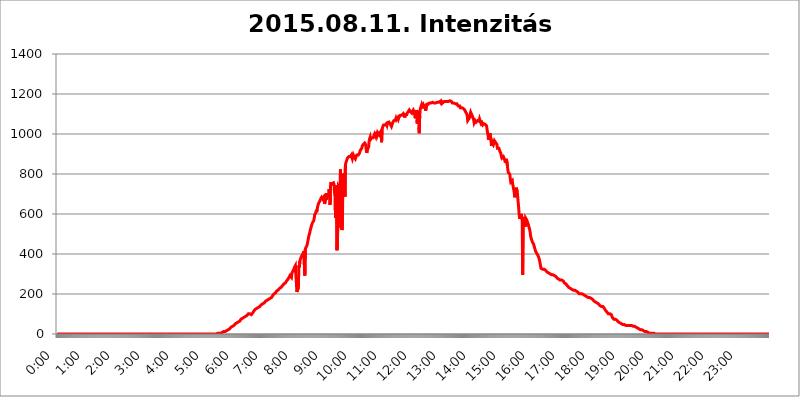
| Category | 2015.08.11. Intenzitás [W/m^2] |
|---|---|
| 0.0 | 0 |
| 0.0006944444444444445 | 0 |
| 0.001388888888888889 | 0 |
| 0.0020833333333333333 | 0 |
| 0.002777777777777778 | 0 |
| 0.003472222222222222 | 0 |
| 0.004166666666666667 | 0 |
| 0.004861111111111111 | 0 |
| 0.005555555555555556 | 0 |
| 0.0062499999999999995 | 0 |
| 0.006944444444444444 | 0 |
| 0.007638888888888889 | 0 |
| 0.008333333333333333 | 0 |
| 0.009027777777777779 | 0 |
| 0.009722222222222222 | 0 |
| 0.010416666666666666 | 0 |
| 0.011111111111111112 | 0 |
| 0.011805555555555555 | 0 |
| 0.012499999999999999 | 0 |
| 0.013194444444444444 | 0 |
| 0.013888888888888888 | 0 |
| 0.014583333333333332 | 0 |
| 0.015277777777777777 | 0 |
| 0.015972222222222224 | 0 |
| 0.016666666666666666 | 0 |
| 0.017361111111111112 | 0 |
| 0.018055555555555557 | 0 |
| 0.01875 | 0 |
| 0.019444444444444445 | 0 |
| 0.02013888888888889 | 0 |
| 0.020833333333333332 | 0 |
| 0.02152777777777778 | 0 |
| 0.022222222222222223 | 0 |
| 0.02291666666666667 | 0 |
| 0.02361111111111111 | 0 |
| 0.024305555555555556 | 0 |
| 0.024999999999999998 | 0 |
| 0.025694444444444447 | 0 |
| 0.02638888888888889 | 0 |
| 0.027083333333333334 | 0 |
| 0.027777777777777776 | 0 |
| 0.02847222222222222 | 0 |
| 0.029166666666666664 | 0 |
| 0.029861111111111113 | 0 |
| 0.030555555555555555 | 0 |
| 0.03125 | 0 |
| 0.03194444444444445 | 0 |
| 0.03263888888888889 | 0 |
| 0.03333333333333333 | 0 |
| 0.034027777777777775 | 0 |
| 0.034722222222222224 | 0 |
| 0.035416666666666666 | 0 |
| 0.036111111111111115 | 0 |
| 0.03680555555555556 | 0 |
| 0.0375 | 0 |
| 0.03819444444444444 | 0 |
| 0.03888888888888889 | 0 |
| 0.03958333333333333 | 0 |
| 0.04027777777777778 | 0 |
| 0.04097222222222222 | 0 |
| 0.041666666666666664 | 0 |
| 0.042361111111111106 | 0 |
| 0.04305555555555556 | 0 |
| 0.043750000000000004 | 0 |
| 0.044444444444444446 | 0 |
| 0.04513888888888889 | 0 |
| 0.04583333333333334 | 0 |
| 0.04652777777777778 | 0 |
| 0.04722222222222222 | 0 |
| 0.04791666666666666 | 0 |
| 0.04861111111111111 | 0 |
| 0.049305555555555554 | 0 |
| 0.049999999999999996 | 0 |
| 0.05069444444444445 | 0 |
| 0.051388888888888894 | 0 |
| 0.052083333333333336 | 0 |
| 0.05277777777777778 | 0 |
| 0.05347222222222222 | 0 |
| 0.05416666666666667 | 0 |
| 0.05486111111111111 | 0 |
| 0.05555555555555555 | 0 |
| 0.05625 | 0 |
| 0.05694444444444444 | 0 |
| 0.057638888888888885 | 0 |
| 0.05833333333333333 | 0 |
| 0.05902777777777778 | 0 |
| 0.059722222222222225 | 0 |
| 0.06041666666666667 | 0 |
| 0.061111111111111116 | 0 |
| 0.06180555555555556 | 0 |
| 0.0625 | 0 |
| 0.06319444444444444 | 0 |
| 0.06388888888888888 | 0 |
| 0.06458333333333334 | 0 |
| 0.06527777777777778 | 0 |
| 0.06597222222222222 | 0 |
| 0.06666666666666667 | 0 |
| 0.06736111111111111 | 0 |
| 0.06805555555555555 | 0 |
| 0.06874999999999999 | 0 |
| 0.06944444444444443 | 0 |
| 0.07013888888888889 | 0 |
| 0.07083333333333333 | 0 |
| 0.07152777777777779 | 0 |
| 0.07222222222222223 | 0 |
| 0.07291666666666667 | 0 |
| 0.07361111111111111 | 0 |
| 0.07430555555555556 | 0 |
| 0.075 | 0 |
| 0.07569444444444444 | 0 |
| 0.0763888888888889 | 0 |
| 0.07708333333333334 | 0 |
| 0.07777777777777778 | 0 |
| 0.07847222222222222 | 0 |
| 0.07916666666666666 | 0 |
| 0.0798611111111111 | 0 |
| 0.08055555555555556 | 0 |
| 0.08125 | 0 |
| 0.08194444444444444 | 0 |
| 0.08263888888888889 | 0 |
| 0.08333333333333333 | 0 |
| 0.08402777777777777 | 0 |
| 0.08472222222222221 | 0 |
| 0.08541666666666665 | 0 |
| 0.08611111111111112 | 0 |
| 0.08680555555555557 | 0 |
| 0.08750000000000001 | 0 |
| 0.08819444444444445 | 0 |
| 0.08888888888888889 | 0 |
| 0.08958333333333333 | 0 |
| 0.09027777777777778 | 0 |
| 0.09097222222222222 | 0 |
| 0.09166666666666667 | 0 |
| 0.09236111111111112 | 0 |
| 0.09305555555555556 | 0 |
| 0.09375 | 0 |
| 0.09444444444444444 | 0 |
| 0.09513888888888888 | 0 |
| 0.09583333333333333 | 0 |
| 0.09652777777777777 | 0 |
| 0.09722222222222222 | 0 |
| 0.09791666666666667 | 0 |
| 0.09861111111111111 | 0 |
| 0.09930555555555555 | 0 |
| 0.09999999999999999 | 0 |
| 0.10069444444444443 | 0 |
| 0.1013888888888889 | 0 |
| 0.10208333333333335 | 0 |
| 0.10277777777777779 | 0 |
| 0.10347222222222223 | 0 |
| 0.10416666666666667 | 0 |
| 0.10486111111111111 | 0 |
| 0.10555555555555556 | 0 |
| 0.10625 | 0 |
| 0.10694444444444444 | 0 |
| 0.1076388888888889 | 0 |
| 0.10833333333333334 | 0 |
| 0.10902777777777778 | 0 |
| 0.10972222222222222 | 0 |
| 0.1111111111111111 | 0 |
| 0.11180555555555556 | 0 |
| 0.11180555555555556 | 0 |
| 0.1125 | 0 |
| 0.11319444444444444 | 0 |
| 0.11388888888888889 | 0 |
| 0.11458333333333333 | 0 |
| 0.11527777777777777 | 0 |
| 0.11597222222222221 | 0 |
| 0.11666666666666665 | 0 |
| 0.1173611111111111 | 0 |
| 0.11805555555555557 | 0 |
| 0.11944444444444445 | 0 |
| 0.12013888888888889 | 0 |
| 0.12083333333333333 | 0 |
| 0.12152777777777778 | 0 |
| 0.12222222222222223 | 0 |
| 0.12291666666666667 | 0 |
| 0.12291666666666667 | 0 |
| 0.12361111111111112 | 0 |
| 0.12430555555555556 | 0 |
| 0.125 | 0 |
| 0.12569444444444444 | 0 |
| 0.12638888888888888 | 0 |
| 0.12708333333333333 | 0 |
| 0.16875 | 0 |
| 0.12847222222222224 | 0 |
| 0.12916666666666668 | 0 |
| 0.12986111111111112 | 0 |
| 0.13055555555555556 | 0 |
| 0.13125 | 0 |
| 0.13194444444444445 | 0 |
| 0.1326388888888889 | 0 |
| 0.13333333333333333 | 0 |
| 0.13402777777777777 | 0 |
| 0.13402777777777777 | 0 |
| 0.13472222222222222 | 0 |
| 0.13541666666666666 | 0 |
| 0.1361111111111111 | 0 |
| 0.13749999999999998 | 0 |
| 0.13819444444444443 | 0 |
| 0.1388888888888889 | 0 |
| 0.13958333333333334 | 0 |
| 0.14027777777777778 | 0 |
| 0.14097222222222222 | 0 |
| 0.14166666666666666 | 0 |
| 0.1423611111111111 | 0 |
| 0.14305555555555557 | 0 |
| 0.14375000000000002 | 0 |
| 0.14444444444444446 | 0 |
| 0.1451388888888889 | 0 |
| 0.1451388888888889 | 0 |
| 0.14652777777777778 | 0 |
| 0.14722222222222223 | 0 |
| 0.14791666666666667 | 0 |
| 0.1486111111111111 | 0 |
| 0.14930555555555555 | 0 |
| 0.15 | 0 |
| 0.15069444444444444 | 0 |
| 0.15138888888888888 | 0 |
| 0.15208333333333332 | 0 |
| 0.15277777777777776 | 0 |
| 0.15347222222222223 | 0 |
| 0.15416666666666667 | 0 |
| 0.15486111111111112 | 0 |
| 0.15555555555555556 | 0 |
| 0.15625 | 0 |
| 0.15694444444444444 | 0 |
| 0.15763888888888888 | 0 |
| 0.15833333333333333 | 0 |
| 0.15902777777777777 | 0 |
| 0.15972222222222224 | 0 |
| 0.16041666666666668 | 0 |
| 0.16111111111111112 | 0 |
| 0.16180555555555556 | 0 |
| 0.1625 | 0 |
| 0.16319444444444445 | 0 |
| 0.1638888888888889 | 0 |
| 0.16458333333333333 | 0 |
| 0.16527777777777777 | 0 |
| 0.16597222222222222 | 0 |
| 0.16666666666666666 | 0 |
| 0.1673611111111111 | 0 |
| 0.16805555555555554 | 0 |
| 0.16874999999999998 | 0 |
| 0.16944444444444443 | 0 |
| 0.17013888888888887 | 0 |
| 0.1708333333333333 | 0 |
| 0.17152777777777775 | 0 |
| 0.17222222222222225 | 0 |
| 0.1729166666666667 | 0 |
| 0.17361111111111113 | 0 |
| 0.17430555555555557 | 0 |
| 0.17500000000000002 | 0 |
| 0.17569444444444446 | 0 |
| 0.1763888888888889 | 0 |
| 0.17708333333333334 | 0 |
| 0.17777777777777778 | 0 |
| 0.17847222222222223 | 0 |
| 0.17916666666666667 | 0 |
| 0.1798611111111111 | 0 |
| 0.18055555555555555 | 0 |
| 0.18125 | 0 |
| 0.18194444444444444 | 0 |
| 0.1826388888888889 | 0 |
| 0.18333333333333335 | 0 |
| 0.1840277777777778 | 0 |
| 0.18472222222222223 | 0 |
| 0.18541666666666667 | 0 |
| 0.18611111111111112 | 0 |
| 0.18680555555555556 | 0 |
| 0.1875 | 0 |
| 0.18819444444444444 | 0 |
| 0.18888888888888888 | 0 |
| 0.18958333333333333 | 0 |
| 0.19027777777777777 | 0 |
| 0.1909722222222222 | 0 |
| 0.19166666666666665 | 0 |
| 0.19236111111111112 | 0 |
| 0.19305555555555554 | 0 |
| 0.19375 | 0 |
| 0.19444444444444445 | 0 |
| 0.1951388888888889 | 0 |
| 0.19583333333333333 | 0 |
| 0.19652777777777777 | 0 |
| 0.19722222222222222 | 0 |
| 0.19791666666666666 | 0 |
| 0.1986111111111111 | 0 |
| 0.19930555555555554 | 0 |
| 0.19999999999999998 | 0 |
| 0.20069444444444443 | 0 |
| 0.20138888888888887 | 0 |
| 0.2020833333333333 | 0 |
| 0.2027777777777778 | 0 |
| 0.2034722222222222 | 0 |
| 0.2041666666666667 | 0 |
| 0.20486111111111113 | 0 |
| 0.20555555555555557 | 0 |
| 0.20625000000000002 | 0 |
| 0.20694444444444446 | 0 |
| 0.2076388888888889 | 0 |
| 0.20833333333333334 | 0 |
| 0.20902777777777778 | 0 |
| 0.20972222222222223 | 0 |
| 0.21041666666666667 | 0 |
| 0.2111111111111111 | 0 |
| 0.21180555555555555 | 0 |
| 0.2125 | 0 |
| 0.21319444444444444 | 0 |
| 0.2138888888888889 | 0 |
| 0.21458333333333335 | 0 |
| 0.2152777777777778 | 0 |
| 0.21597222222222223 | 0 |
| 0.21666666666666667 | 0 |
| 0.21736111111111112 | 0 |
| 0.21805555555555556 | 0 |
| 0.21875 | 0 |
| 0.21944444444444444 | 0 |
| 0.22013888888888888 | 0 |
| 0.22083333333333333 | 0 |
| 0.22152777777777777 | 0 |
| 0.2222222222222222 | 0 |
| 0.22291666666666665 | 0 |
| 0.2236111111111111 | 0 |
| 0.22430555555555556 | 3.525 |
| 0.225 | 3.525 |
| 0.22569444444444445 | 3.525 |
| 0.2263888888888889 | 3.525 |
| 0.22708333333333333 | 3.525 |
| 0.22777777777777777 | 3.525 |
| 0.22847222222222222 | 3.525 |
| 0.22916666666666666 | 3.525 |
| 0.2298611111111111 | 3.525 |
| 0.23055555555555554 | 7.887 |
| 0.23124999999999998 | 7.887 |
| 0.23194444444444443 | 7.887 |
| 0.23263888888888887 | 7.887 |
| 0.2333333333333333 | 12.257 |
| 0.2340277777777778 | 12.257 |
| 0.2347222222222222 | 12.257 |
| 0.2354166666666667 | 12.257 |
| 0.23611111111111113 | 12.257 |
| 0.23680555555555557 | 16.636 |
| 0.23750000000000002 | 16.636 |
| 0.23819444444444446 | 16.636 |
| 0.2388888888888889 | 21.024 |
| 0.23958333333333334 | 21.024 |
| 0.24027777777777778 | 21.024 |
| 0.24097222222222223 | 25.419 |
| 0.24166666666666667 | 25.419 |
| 0.2423611111111111 | 29.823 |
| 0.24305555555555555 | 29.823 |
| 0.24375 | 34.234 |
| 0.24444444444444446 | 34.234 |
| 0.24513888888888888 | 38.653 |
| 0.24583333333333335 | 38.653 |
| 0.2465277777777778 | 38.653 |
| 0.24722222222222223 | 43.079 |
| 0.24791666666666667 | 43.079 |
| 0.24861111111111112 | 47.511 |
| 0.24930555555555556 | 47.511 |
| 0.25 | 51.951 |
| 0.25069444444444444 | 51.951 |
| 0.2513888888888889 | 51.951 |
| 0.2520833333333333 | 56.398 |
| 0.25277777777777777 | 56.398 |
| 0.2534722222222222 | 60.85 |
| 0.25416666666666665 | 60.85 |
| 0.2548611111111111 | 65.31 |
| 0.2555555555555556 | 65.31 |
| 0.25625000000000003 | 65.31 |
| 0.2569444444444445 | 69.775 |
| 0.2576388888888889 | 74.246 |
| 0.25833333333333336 | 74.246 |
| 0.2590277777777778 | 74.246 |
| 0.25972222222222224 | 78.722 |
| 0.2604166666666667 | 83.205 |
| 0.2611111111111111 | 83.205 |
| 0.26180555555555557 | 83.205 |
| 0.2625 | 83.205 |
| 0.26319444444444445 | 87.692 |
| 0.2638888888888889 | 87.692 |
| 0.26458333333333334 | 92.184 |
| 0.2652777777777778 | 92.184 |
| 0.2659722222222222 | 92.184 |
| 0.26666666666666666 | 92.184 |
| 0.2673611111111111 | 96.682 |
| 0.26805555555555555 | 101.184 |
| 0.26875 | 101.184 |
| 0.26944444444444443 | 101.184 |
| 0.2701388888888889 | 101.184 |
| 0.2708333333333333 | 96.682 |
| 0.27152777777777776 | 96.682 |
| 0.2722222222222222 | 96.682 |
| 0.27291666666666664 | 96.682 |
| 0.2736111111111111 | 101.184 |
| 0.2743055555555555 | 105.69 |
| 0.27499999999999997 | 110.201 |
| 0.27569444444444446 | 114.716 |
| 0.27638888888888885 | 119.235 |
| 0.27708333333333335 | 119.235 |
| 0.2777777777777778 | 123.758 |
| 0.27847222222222223 | 128.284 |
| 0.2791666666666667 | 128.284 |
| 0.2798611111111111 | 128.284 |
| 0.28055555555555556 | 132.814 |
| 0.28125 | 132.814 |
| 0.28194444444444444 | 132.814 |
| 0.2826388888888889 | 137.347 |
| 0.2833333333333333 | 137.347 |
| 0.28402777777777777 | 137.347 |
| 0.2847222222222222 | 137.347 |
| 0.28541666666666665 | 141.884 |
| 0.28611111111111115 | 146.423 |
| 0.28680555555555554 | 146.423 |
| 0.28750000000000003 | 150.964 |
| 0.2881944444444445 | 150.964 |
| 0.2888888888888889 | 155.509 |
| 0.28958333333333336 | 155.509 |
| 0.2902777777777778 | 155.509 |
| 0.29097222222222224 | 160.056 |
| 0.2916666666666667 | 160.056 |
| 0.2923611111111111 | 164.605 |
| 0.29305555555555557 | 164.605 |
| 0.29375 | 164.605 |
| 0.29444444444444445 | 169.156 |
| 0.2951388888888889 | 169.156 |
| 0.29583333333333334 | 169.156 |
| 0.2965277777777778 | 173.709 |
| 0.2972222222222222 | 173.709 |
| 0.29791666666666666 | 178.264 |
| 0.2986111111111111 | 178.264 |
| 0.29930555555555555 | 182.82 |
| 0.3 | 182.82 |
| 0.30069444444444443 | 182.82 |
| 0.3013888888888889 | 187.378 |
| 0.3020833333333333 | 191.937 |
| 0.30277777777777776 | 191.937 |
| 0.3034722222222222 | 191.937 |
| 0.30416666666666664 | 201.058 |
| 0.3048611111111111 | 201.058 |
| 0.3055555555555555 | 205.62 |
| 0.30624999999999997 | 205.62 |
| 0.3069444444444444 | 210.182 |
| 0.3076388888888889 | 214.746 |
| 0.30833333333333335 | 214.746 |
| 0.3090277777777778 | 214.746 |
| 0.30972222222222223 | 219.309 |
| 0.3104166666666667 | 219.309 |
| 0.3111111111111111 | 223.873 |
| 0.31180555555555556 | 228.436 |
| 0.3125 | 228.436 |
| 0.31319444444444444 | 233 |
| 0.3138888888888889 | 233 |
| 0.3145833333333333 | 237.564 |
| 0.31527777777777777 | 237.564 |
| 0.3159722222222222 | 242.127 |
| 0.31666666666666665 | 242.127 |
| 0.31736111111111115 | 246.689 |
| 0.31805555555555554 | 251.251 |
| 0.31875000000000003 | 251.251 |
| 0.3194444444444445 | 255.813 |
| 0.3201388888888889 | 255.813 |
| 0.32083333333333336 | 260.373 |
| 0.3215277777777778 | 264.932 |
| 0.32222222222222224 | 269.49 |
| 0.3229166666666667 | 269.49 |
| 0.3236111111111111 | 274.047 |
| 0.32430555555555557 | 278.603 |
| 0.325 | 283.156 |
| 0.32569444444444445 | 287.709 |
| 0.3263888888888889 | 292.259 |
| 0.32708333333333334 | 287.709 |
| 0.3277777777777778 | 296.808 |
| 0.3284722222222222 | 283.156 |
| 0.32916666666666666 | 305.898 |
| 0.3298611111111111 | 305.898 |
| 0.33055555555555555 | 314.98 |
| 0.33125 | 319.517 |
| 0.33194444444444443 | 324.052 |
| 0.3326388888888889 | 333.113 |
| 0.3333333333333333 | 337.639 |
| 0.3340277777777778 | 342.162 |
| 0.3347222222222222 | 346.682 |
| 0.3354166666666667 | 346.682 |
| 0.3361111111111111 | 210.182 |
| 0.3368055555555556 | 205.62 |
| 0.33749999999999997 | 210.182 |
| 0.33819444444444446 | 233 |
| 0.33888888888888885 | 342.162 |
| 0.33958333333333335 | 333.113 |
| 0.34027777777777773 | 364.728 |
| 0.34097222222222223 | 373.729 |
| 0.3416666666666666 | 378.224 |
| 0.3423611111111111 | 387.202 |
| 0.3430555555555555 | 391.685 |
| 0.34375 | 396.164 |
| 0.3444444444444445 | 400.638 |
| 0.3451388888888889 | 405.108 |
| 0.3458333333333334 | 414.035 |
| 0.34652777777777777 | 418.492 |
| 0.34722222222222227 | 292.259 |
| 0.34791666666666665 | 422.943 |
| 0.34861111111111115 | 431.833 |
| 0.34930555555555554 | 436.27 |
| 0.35000000000000003 | 440.702 |
| 0.3506944444444444 | 449.551 |
| 0.3513888888888889 | 462.786 |
| 0.3520833333333333 | 475.972 |
| 0.3527777777777778 | 489.108 |
| 0.3534722222222222 | 497.836 |
| 0.3541666666666667 | 506.542 |
| 0.3548611111111111 | 519.555 |
| 0.35555555555555557 | 528.2 |
| 0.35625 | 536.82 |
| 0.35694444444444445 | 541.121 |
| 0.3576388888888889 | 553.986 |
| 0.35833333333333334 | 558.261 |
| 0.3590277777777778 | 558.261 |
| 0.3597222222222222 | 566.793 |
| 0.36041666666666666 | 579.542 |
| 0.3611111111111111 | 596.45 |
| 0.36180555555555555 | 600.661 |
| 0.3625 | 604.864 |
| 0.36319444444444443 | 617.436 |
| 0.3638888888888889 | 609.062 |
| 0.3645833333333333 | 625.784 |
| 0.3652777777777778 | 638.256 |
| 0.3659722222222222 | 646.537 |
| 0.3666666666666667 | 654.791 |
| 0.3673611111111111 | 654.791 |
| 0.3680555555555556 | 663.019 |
| 0.36874999999999997 | 667.123 |
| 0.36944444444444446 | 675.311 |
| 0.37013888888888885 | 679.395 |
| 0.37083333333333335 | 683.473 |
| 0.37152777777777773 | 683.473 |
| 0.37222222222222223 | 675.311 |
| 0.3729166666666666 | 675.311 |
| 0.3736111111111111 | 683.473 |
| 0.3743055555555555 | 683.473 |
| 0.375 | 650.667 |
| 0.3756944444444445 | 658.909 |
| 0.3763888888888889 | 699.717 |
| 0.3770833333333334 | 671.22 |
| 0.37777777777777777 | 703.762 |
| 0.37847222222222227 | 683.473 |
| 0.37916666666666665 | 687.544 |
| 0.37986111111111115 | 683.473 |
| 0.38055555555555554 | 695.666 |
| 0.38125000000000003 | 723.889 |
| 0.3819444444444444 | 703.762 |
| 0.3826388888888889 | 646.537 |
| 0.3833333333333333 | 743.859 |
| 0.3840277777777778 | 759.723 |
| 0.3847222222222222 | 743.859 |
| 0.3854166666666667 | 751.803 |
| 0.3861111111111111 | 755.766 |
| 0.38680555555555557 | 755.766 |
| 0.3875 | 755.766 |
| 0.38819444444444445 | 747.834 |
| 0.3888888888888889 | 703.762 |
| 0.38958333333333334 | 719.877 |
| 0.3902777777777778 | 579.542 |
| 0.3909722222222222 | 609.062 |
| 0.39166666666666666 | 743.859 |
| 0.3923611111111111 | 418.492 |
| 0.39305555555555555 | 484.735 |
| 0.39375 | 545.416 |
| 0.39444444444444443 | 739.877 |
| 0.3951388888888889 | 735.89 |
| 0.3958333333333333 | 731.896 |
| 0.3965277777777778 | 592.233 |
| 0.3972222222222222 | 822.26 |
| 0.3979166666666667 | 532.513 |
| 0.3986111111111111 | 675.311 |
| 0.3993055555555556 | 519.555 |
| 0.39999999999999997 | 562.53 |
| 0.40069444444444446 | 802.868 |
| 0.40138888888888885 | 743.859 |
| 0.40208333333333335 | 759.723 |
| 0.40277777777777773 | 798.974 |
| 0.40347222222222223 | 687.544 |
| 0.4041666666666666 | 845.365 |
| 0.4048611111111111 | 856.855 |
| 0.4055555555555555 | 860.676 |
| 0.40625 | 872.114 |
| 0.4069444444444445 | 879.719 |
| 0.4076388888888889 | 875.918 |
| 0.4083333333333334 | 883.516 |
| 0.40902777777777777 | 887.309 |
| 0.40972222222222227 | 887.309 |
| 0.41041666666666665 | 891.099 |
| 0.41111111111111115 | 887.309 |
| 0.41180555555555554 | 887.309 |
| 0.41250000000000003 | 894.885 |
| 0.4131944444444444 | 883.516 |
| 0.4138888888888889 | 875.918 |
| 0.4145833333333333 | 875.918 |
| 0.4152777777777778 | 894.885 |
| 0.4159722222222222 | 894.885 |
| 0.4166666666666667 | 883.516 |
| 0.4173611111111111 | 879.719 |
| 0.41805555555555557 | 875.918 |
| 0.41875 | 883.516 |
| 0.41944444444444445 | 887.309 |
| 0.4201388888888889 | 894.885 |
| 0.42083333333333334 | 898.668 |
| 0.4215277777777778 | 898.668 |
| 0.4222222222222222 | 894.885 |
| 0.42291666666666666 | 894.885 |
| 0.4236111111111111 | 902.447 |
| 0.42430555555555555 | 909.996 |
| 0.425 | 917.534 |
| 0.42569444444444443 | 917.534 |
| 0.4263888888888889 | 917.534 |
| 0.4270833333333333 | 928.819 |
| 0.4277777777777778 | 940.082 |
| 0.4284722222222222 | 943.832 |
| 0.4291666666666667 | 947.58 |
| 0.4298611111111111 | 947.58 |
| 0.4305555555555556 | 951.327 |
| 0.43124999999999997 | 955.071 |
| 0.43194444444444446 | 955.071 |
| 0.43263888888888885 | 947.58 |
| 0.43333333333333335 | 921.298 |
| 0.43402777777777773 | 906.223 |
| 0.43472222222222223 | 913.766 |
| 0.4354166666666666 | 925.06 |
| 0.4361111111111111 | 928.819 |
| 0.4368055555555555 | 936.33 |
| 0.4375 | 966.295 |
| 0.4381944444444445 | 977.508 |
| 0.4388888888888889 | 984.98 |
| 0.4395833333333334 | 973.772 |
| 0.44027777777777777 | 970.034 |
| 0.44097222222222227 | 981.244 |
| 0.44166666666666665 | 981.244 |
| 0.44236111111111115 | 977.508 |
| 0.44305555555555554 | 981.244 |
| 0.44375000000000003 | 984.98 |
| 0.4444444444444444 | 984.98 |
| 0.4451388888888889 | 999.916 |
| 0.4458333333333333 | 999.916 |
| 0.4465277777777778 | 988.714 |
| 0.4472222222222222 | 1011.118 |
| 0.4479166666666667 | 1003.65 |
| 0.4486111111111111 | 996.182 |
| 0.44930555555555557 | 1007.383 |
| 0.45 | 1011.118 |
| 0.45069444444444445 | 1003.65 |
| 0.4513888888888889 | 996.182 |
| 0.45208333333333334 | 992.448 |
| 0.4527777777777778 | 1007.383 |
| 0.4534722222222222 | 1011.118 |
| 0.45416666666666666 | 1014.852 |
| 0.4548611111111111 | 958.814 |
| 0.45555555555555555 | 1018.587 |
| 0.45625 | 1033.537 |
| 0.45694444444444443 | 1037.277 |
| 0.4576388888888889 | 1044.762 |
| 0.4583333333333333 | 1041.019 |
| 0.4590277777777778 | 1044.762 |
| 0.4597222222222222 | 1044.762 |
| 0.4604166666666667 | 1048.508 |
| 0.4611111111111111 | 1048.508 |
| 0.4618055555555556 | 1052.255 |
| 0.46249999999999997 | 1044.762 |
| 0.46319444444444446 | 1056.004 |
| 0.46388888888888885 | 1059.756 |
| 0.46458333333333335 | 1059.756 |
| 0.46527777777777773 | 1059.756 |
| 0.46597222222222223 | 1059.756 |
| 0.4666666666666666 | 1052.255 |
| 0.4673611111111111 | 1052.255 |
| 0.4680555555555555 | 1056.004 |
| 0.46875 | 1037.277 |
| 0.4694444444444445 | 1037.277 |
| 0.4701388888888889 | 1052.255 |
| 0.4708333333333334 | 1059.756 |
| 0.47152777777777777 | 1059.756 |
| 0.47222222222222227 | 1067.267 |
| 0.47291666666666665 | 1063.51 |
| 0.47361111111111115 | 1071.027 |
| 0.47430555555555554 | 1071.027 |
| 0.47500000000000003 | 1078.555 |
| 0.4756944444444444 | 1071.027 |
| 0.4763888888888889 | 1074.789 |
| 0.4770833333333333 | 1074.789 |
| 0.4777777777777778 | 1082.324 |
| 0.4784722222222222 | 1074.789 |
| 0.4791666666666667 | 1082.324 |
| 0.4798611111111111 | 1086.097 |
| 0.48055555555555557 | 1082.324 |
| 0.48125 | 1093.653 |
| 0.48194444444444445 | 1093.653 |
| 0.4826388888888889 | 1093.653 |
| 0.48333333333333334 | 1093.653 |
| 0.4840277777777778 | 1093.653 |
| 0.4847222222222222 | 1097.437 |
| 0.48541666666666666 | 1101.226 |
| 0.4861111111111111 | 1097.437 |
| 0.48680555555555555 | 1089.873 |
| 0.4875 | 1082.324 |
| 0.48819444444444443 | 1097.437 |
| 0.4888888888888889 | 1093.653 |
| 0.4895833333333333 | 1093.653 |
| 0.4902777777777778 | 1097.437 |
| 0.4909722222222222 | 1105.019 |
| 0.4916666666666667 | 1105.019 |
| 0.4923611111111111 | 1112.618 |
| 0.4930555555555556 | 1116.426 |
| 0.49374999999999997 | 1120.238 |
| 0.49444444444444446 | 1116.426 |
| 0.49513888888888885 | 1112.618 |
| 0.49583333333333335 | 1116.426 |
| 0.49652777777777773 | 1108.816 |
| 0.49722222222222223 | 1105.019 |
| 0.4979166666666666 | 1112.618 |
| 0.4986111111111111 | 1116.426 |
| 0.4993055555555555 | 1120.238 |
| 0.5 | 1120.238 |
| 0.5006944444444444 | 1108.816 |
| 0.5013888888888889 | 1108.816 |
| 0.5020833333333333 | 1078.555 |
| 0.5027777777777778 | 1089.873 |
| 0.5034722222222222 | 1120.238 |
| 0.5041666666666667 | 1093.653 |
| 0.5048611111111111 | 1052.255 |
| 0.5055555555555555 | 1101.226 |
| 0.50625 | 1116.426 |
| 0.5069444444444444 | 1108.816 |
| 0.5076388888888889 | 1003.65 |
| 0.5083333333333333 | 1089.873 |
| 0.5090277777777777 | 1124.056 |
| 0.5097222222222222 | 1120.238 |
| 0.5104166666666666 | 1120.238 |
| 0.5111111111111112 | 1147.086 |
| 0.5118055555555555 | 1139.384 |
| 0.5125000000000001 | 1143.232 |
| 0.5131944444444444 | 1147.086 |
| 0.513888888888889 | 1139.384 |
| 0.5145833333333333 | 1127.879 |
| 0.5152777777777778 | 1147.086 |
| 0.5159722222222222 | 1131.708 |
| 0.5166666666666667 | 1116.426 |
| 0.517361111111111 | 1120.238 |
| 0.5180555555555556 | 1143.232 |
| 0.5187499999999999 | 1154.814 |
| 0.5194444444444445 | 1143.232 |
| 0.5201388888888888 | 1150.946 |
| 0.5208333333333334 | 1154.814 |
| 0.5215277777777778 | 1154.814 |
| 0.5222222222222223 | 1154.814 |
| 0.5229166666666667 | 1154.814 |
| 0.5236111111111111 | 1154.814 |
| 0.5243055555555556 | 1154.814 |
| 0.525 | 1158.689 |
| 0.5256944444444445 | 1158.689 |
| 0.5263888888888889 | 1158.689 |
| 0.5270833333333333 | 1154.814 |
| 0.5277777777777778 | 1158.689 |
| 0.5284722222222222 | 1154.814 |
| 0.5291666666666667 | 1158.689 |
| 0.5298611111111111 | 1158.689 |
| 0.5305555555555556 | 1154.814 |
| 0.53125 | 1158.689 |
| 0.5319444444444444 | 1158.689 |
| 0.5326388888888889 | 1158.689 |
| 0.5333333333333333 | 1158.689 |
| 0.5340277777777778 | 1158.689 |
| 0.5347222222222222 | 1158.689 |
| 0.5354166666666667 | 1158.689 |
| 0.5361111111111111 | 1158.689 |
| 0.5368055555555555 | 1162.571 |
| 0.5375 | 1162.571 |
| 0.5381944444444444 | 1154.814 |
| 0.5388888888888889 | 1162.571 |
| 0.5395833333333333 | 1158.689 |
| 0.5402777777777777 | 1154.814 |
| 0.5409722222222222 | 1158.689 |
| 0.5416666666666666 | 1158.689 |
| 0.5423611111111112 | 1162.571 |
| 0.5430555555555555 | 1162.571 |
| 0.5437500000000001 | 1162.571 |
| 0.5444444444444444 | 1162.571 |
| 0.545138888888889 | 1162.571 |
| 0.5458333333333333 | 1162.571 |
| 0.5465277777777778 | 1162.571 |
| 0.5472222222222222 | 1162.571 |
| 0.5479166666666667 | 1162.571 |
| 0.548611111111111 | 1162.571 |
| 0.5493055555555556 | 1162.571 |
| 0.5499999999999999 | 1166.46 |
| 0.5506944444444445 | 1166.46 |
| 0.5513888888888888 | 1162.571 |
| 0.5520833333333334 | 1166.46 |
| 0.5527777777777778 | 1162.571 |
| 0.5534722222222223 | 1162.571 |
| 0.5541666666666667 | 1154.814 |
| 0.5548611111111111 | 1154.814 |
| 0.5555555555555556 | 1154.814 |
| 0.55625 | 1154.814 |
| 0.5569444444444445 | 1158.689 |
| 0.5576388888888889 | 1154.814 |
| 0.5583333333333333 | 1150.946 |
| 0.5590277777777778 | 1154.814 |
| 0.5597222222222222 | 1147.086 |
| 0.5604166666666667 | 1150.946 |
| 0.5611111111111111 | 1150.946 |
| 0.5618055555555556 | 1147.086 |
| 0.5625 | 1139.384 |
| 0.5631944444444444 | 1139.384 |
| 0.5638888888888889 | 1139.384 |
| 0.5645833333333333 | 1139.384 |
| 0.5652777777777778 | 1131.708 |
| 0.5659722222222222 | 1131.708 |
| 0.5666666666666667 | 1131.708 |
| 0.5673611111111111 | 1131.708 |
| 0.5680555555555555 | 1131.708 |
| 0.56875 | 1135.543 |
| 0.5694444444444444 | 1127.879 |
| 0.5701388888888889 | 1124.056 |
| 0.5708333333333333 | 1124.056 |
| 0.5715277777777777 | 1120.238 |
| 0.5722222222222222 | 1120.238 |
| 0.5729166666666666 | 1108.816 |
| 0.5736111111111112 | 1108.816 |
| 0.5743055555555555 | 1101.226 |
| 0.5750000000000001 | 1089.873 |
| 0.5756944444444444 | 1067.267 |
| 0.576388888888889 | 1067.267 |
| 0.5770833333333333 | 1074.789 |
| 0.5777777777777778 | 1078.555 |
| 0.5784722222222222 | 1082.324 |
| 0.5791666666666667 | 1097.437 |
| 0.579861111111111 | 1108.816 |
| 0.5805555555555556 | 1105.019 |
| 0.5812499999999999 | 1097.437 |
| 0.5819444444444445 | 1093.653 |
| 0.5826388888888888 | 1086.097 |
| 0.5833333333333334 | 1086.097 |
| 0.5840277777777778 | 1071.027 |
| 0.5847222222222223 | 1056.004 |
| 0.5854166666666667 | 1056.004 |
| 0.5861111111111111 | 1067.267 |
| 0.5868055555555556 | 1067.267 |
| 0.5875 | 1059.756 |
| 0.5881944444444445 | 1059.756 |
| 0.5888888888888889 | 1063.51 |
| 0.5895833333333333 | 1067.267 |
| 0.5902777777777778 | 1071.027 |
| 0.5909722222222222 | 1071.027 |
| 0.5916666666666667 | 1063.51 |
| 0.5923611111111111 | 1074.789 |
| 0.5930555555555556 | 1067.267 |
| 0.59375 | 1059.756 |
| 0.5944444444444444 | 1067.267 |
| 0.5951388888888889 | 1052.255 |
| 0.5958333333333333 | 1052.255 |
| 0.5965277777777778 | 1044.762 |
| 0.5972222222222222 | 1048.508 |
| 0.5979166666666667 | 1052.255 |
| 0.5986111111111111 | 1056.004 |
| 0.5993055555555555 | 1056.004 |
| 0.6 | 1048.508 |
| 0.6006944444444444 | 1052.255 |
| 0.6013888888888889 | 1052.255 |
| 0.6020833333333333 | 1041.019 |
| 0.6027777777777777 | 1037.277 |
| 0.6034722222222222 | 1007.383 |
| 0.6041666666666666 | 996.182 |
| 0.6048611111111112 | 970.034 |
| 0.6055555555555555 | 988.714 |
| 0.6062500000000001 | 973.772 |
| 0.6069444444444444 | 1003.65 |
| 0.607638888888889 | 984.98 |
| 0.6083333333333333 | 970.034 |
| 0.6090277777777778 | 940.082 |
| 0.6097222222222222 | 940.082 |
| 0.6104166666666667 | 958.814 |
| 0.611111111111111 | 958.814 |
| 0.6118055555555556 | 947.58 |
| 0.6124999999999999 | 955.071 |
| 0.6131944444444445 | 966.295 |
| 0.6138888888888888 | 966.295 |
| 0.6145833333333334 | 966.295 |
| 0.6152777777777778 | 955.071 |
| 0.6159722222222223 | 958.814 |
| 0.6166666666666667 | 947.58 |
| 0.6173611111111111 | 928.819 |
| 0.6180555555555556 | 932.576 |
| 0.61875 | 925.06 |
| 0.6194444444444445 | 928.819 |
| 0.6201388888888889 | 921.298 |
| 0.6208333333333333 | 913.766 |
| 0.6215277777777778 | 913.766 |
| 0.6222222222222222 | 902.447 |
| 0.6229166666666667 | 887.309 |
| 0.6236111111111111 | 879.719 |
| 0.6243055555555556 | 883.516 |
| 0.625 | 883.516 |
| 0.6256944444444444 | 887.309 |
| 0.6263888888888889 | 883.516 |
| 0.6270833333333333 | 875.918 |
| 0.6277777777777778 | 872.114 |
| 0.6284722222222222 | 856.855 |
| 0.6291666666666667 | 868.305 |
| 0.6298611111111111 | 875.918 |
| 0.6305555555555555 | 872.114 |
| 0.63125 | 845.365 |
| 0.6319444444444444 | 822.26 |
| 0.6326388888888889 | 806.757 |
| 0.6333333333333333 | 802.868 |
| 0.6340277777777777 | 806.757 |
| 0.6347222222222222 | 798.974 |
| 0.6354166666666666 | 775.492 |
| 0.6361111111111112 | 759.723 |
| 0.6368055555555555 | 759.723 |
| 0.6375000000000001 | 759.723 |
| 0.6381944444444444 | 767.62 |
| 0.638888888888889 | 747.834 |
| 0.6395833333333333 | 743.859 |
| 0.6402777777777778 | 751.803 |
| 0.6409722222222222 | 707.8 |
| 0.6416666666666667 | 683.473 |
| 0.642361111111111 | 687.544 |
| 0.6430555555555556 | 719.877 |
| 0.6437499999999999 | 731.896 |
| 0.6444444444444445 | 727.896 |
| 0.6451388888888888 | 711.832 |
| 0.6458333333333334 | 683.473 |
| 0.6465277777777778 | 654.791 |
| 0.6472222222222223 | 629.948 |
| 0.6479166666666667 | 592.233 |
| 0.6486111111111111 | 575.299 |
| 0.6493055555555556 | 579.542 |
| 0.65 | 592.233 |
| 0.6506944444444445 | 600.661 |
| 0.6513888888888889 | 604.864 |
| 0.6520833333333333 | 575.299 |
| 0.6527777777777778 | 296.808 |
| 0.6534722222222222 | 583.779 |
| 0.6541666666666667 | 579.542 |
| 0.6548611111111111 | 571.049 |
| 0.6555555555555556 | 579.542 |
| 0.65625 | 536.82 |
| 0.6569444444444444 | 579.542 |
| 0.6576388888888889 | 579.542 |
| 0.6583333333333333 | 571.049 |
| 0.6590277777777778 | 566.793 |
| 0.6597222222222222 | 558.261 |
| 0.6604166666666667 | 549.704 |
| 0.6611111111111111 | 541.121 |
| 0.6618055555555555 | 532.513 |
| 0.6625 | 523.88 |
| 0.6631944444444444 | 510.885 |
| 0.6638888888888889 | 489.108 |
| 0.6645833333333333 | 480.356 |
| 0.6652777777777777 | 471.582 |
| 0.6659722222222222 | 467.187 |
| 0.6666666666666666 | 458.38 |
| 0.6673611111111111 | 458.38 |
| 0.6680555555555556 | 449.551 |
| 0.6687500000000001 | 440.702 |
| 0.6694444444444444 | 436.27 |
| 0.6701388888888888 | 422.943 |
| 0.6708333333333334 | 414.035 |
| 0.6715277777777778 | 414.035 |
| 0.6722222222222222 | 409.574 |
| 0.6729166666666666 | 400.638 |
| 0.6736111111111112 | 396.164 |
| 0.6743055555555556 | 391.685 |
| 0.6749999999999999 | 387.202 |
| 0.6756944444444444 | 378.224 |
| 0.6763888888888889 | 369.23 |
| 0.6770833333333334 | 355.712 |
| 0.6777777777777777 | 342.162 |
| 0.6784722222222223 | 328.584 |
| 0.6791666666666667 | 324.052 |
| 0.6798611111111111 | 324.052 |
| 0.6805555555555555 | 324.052 |
| 0.68125 | 324.052 |
| 0.6819444444444445 | 324.052 |
| 0.6826388888888889 | 324.052 |
| 0.6833333333333332 | 319.517 |
| 0.6840277777777778 | 319.517 |
| 0.6847222222222222 | 319.517 |
| 0.6854166666666667 | 319.517 |
| 0.686111111111111 | 314.98 |
| 0.6868055555555556 | 310.44 |
| 0.6875 | 310.44 |
| 0.6881944444444444 | 305.898 |
| 0.688888888888889 | 305.898 |
| 0.6895833333333333 | 305.898 |
| 0.6902777777777778 | 305.898 |
| 0.6909722222222222 | 301.354 |
| 0.6916666666666668 | 301.354 |
| 0.6923611111111111 | 296.808 |
| 0.6930555555555555 | 296.808 |
| 0.69375 | 296.808 |
| 0.6944444444444445 | 296.808 |
| 0.6951388888888889 | 296.808 |
| 0.6958333333333333 | 292.259 |
| 0.6965277777777777 | 292.259 |
| 0.6972222222222223 | 292.259 |
| 0.6979166666666666 | 292.259 |
| 0.6986111111111111 | 287.709 |
| 0.6993055555555556 | 287.709 |
| 0.7000000000000001 | 287.709 |
| 0.7006944444444444 | 283.156 |
| 0.7013888888888888 | 278.603 |
| 0.7020833333333334 | 278.603 |
| 0.7027777777777778 | 274.047 |
| 0.7034722222222222 | 274.047 |
| 0.7041666666666666 | 274.047 |
| 0.7048611111111112 | 269.49 |
| 0.7055555555555556 | 269.49 |
| 0.7062499999999999 | 269.49 |
| 0.7069444444444444 | 269.49 |
| 0.7076388888888889 | 269.49 |
| 0.7083333333333334 | 264.932 |
| 0.7090277777777777 | 264.932 |
| 0.7097222222222223 | 264.932 |
| 0.7104166666666667 | 260.373 |
| 0.7111111111111111 | 255.813 |
| 0.7118055555555555 | 255.813 |
| 0.7125 | 251.251 |
| 0.7131944444444445 | 251.251 |
| 0.7138888888888889 | 251.251 |
| 0.7145833333333332 | 246.689 |
| 0.7152777777777778 | 242.127 |
| 0.7159722222222222 | 242.127 |
| 0.7166666666666667 | 237.564 |
| 0.717361111111111 | 233 |
| 0.7180555555555556 | 233 |
| 0.71875 | 228.436 |
| 0.7194444444444444 | 228.436 |
| 0.720138888888889 | 223.873 |
| 0.7208333333333333 | 223.873 |
| 0.7215277777777778 | 223.873 |
| 0.7222222222222222 | 223.873 |
| 0.7229166666666668 | 219.309 |
| 0.7236111111111111 | 219.309 |
| 0.7243055555555555 | 219.309 |
| 0.725 | 219.309 |
| 0.7256944444444445 | 219.309 |
| 0.7263888888888889 | 219.309 |
| 0.7270833333333333 | 214.746 |
| 0.7277777777777777 | 214.746 |
| 0.7284722222222223 | 210.182 |
| 0.7291666666666666 | 210.182 |
| 0.7298611111111111 | 210.182 |
| 0.7305555555555556 | 205.62 |
| 0.7312500000000001 | 205.62 |
| 0.7319444444444444 | 201.058 |
| 0.7326388888888888 | 205.62 |
| 0.7333333333333334 | 201.058 |
| 0.7340277777777778 | 201.058 |
| 0.7347222222222222 | 201.058 |
| 0.7354166666666666 | 201.058 |
| 0.7361111111111112 | 201.058 |
| 0.7368055555555556 | 201.058 |
| 0.7374999999999999 | 196.497 |
| 0.7381944444444444 | 196.497 |
| 0.7388888888888889 | 196.497 |
| 0.7395833333333334 | 196.497 |
| 0.7402777777777777 | 191.937 |
| 0.7409722222222223 | 191.937 |
| 0.7416666666666667 | 191.937 |
| 0.7423611111111111 | 187.378 |
| 0.7430555555555555 | 187.378 |
| 0.74375 | 187.378 |
| 0.7444444444444445 | 182.82 |
| 0.7451388888888889 | 182.82 |
| 0.7458333333333332 | 182.82 |
| 0.7465277777777778 | 182.82 |
| 0.7472222222222222 | 178.264 |
| 0.7479166666666667 | 178.264 |
| 0.748611111111111 | 178.264 |
| 0.7493055555555556 | 173.709 |
| 0.75 | 173.709 |
| 0.7506944444444444 | 173.709 |
| 0.751388888888889 | 169.156 |
| 0.7520833333333333 | 169.156 |
| 0.7527777777777778 | 164.605 |
| 0.7534722222222222 | 164.605 |
| 0.7541666666666668 | 164.605 |
| 0.7548611111111111 | 160.056 |
| 0.7555555555555555 | 160.056 |
| 0.75625 | 155.509 |
| 0.7569444444444445 | 155.509 |
| 0.7576388888888889 | 155.509 |
| 0.7583333333333333 | 150.964 |
| 0.7590277777777777 | 150.964 |
| 0.7597222222222223 | 146.423 |
| 0.7604166666666666 | 146.423 |
| 0.7611111111111111 | 141.884 |
| 0.7618055555555556 | 141.884 |
| 0.7625000000000001 | 137.347 |
| 0.7631944444444444 | 137.347 |
| 0.7638888888888888 | 137.347 |
| 0.7645833333333334 | 137.347 |
| 0.7652777777777778 | 137.347 |
| 0.7659722222222222 | 132.814 |
| 0.7666666666666666 | 132.814 |
| 0.7673611111111112 | 128.284 |
| 0.7680555555555556 | 123.758 |
| 0.7687499999999999 | 119.235 |
| 0.7694444444444444 | 114.716 |
| 0.7701388888888889 | 114.716 |
| 0.7708333333333334 | 110.201 |
| 0.7715277777777777 | 105.69 |
| 0.7722222222222223 | 105.69 |
| 0.7729166666666667 | 101.184 |
| 0.7736111111111111 | 101.184 |
| 0.7743055555555555 | 101.184 |
| 0.775 | 101.184 |
| 0.7756944444444445 | 101.184 |
| 0.7763888888888889 | 101.184 |
| 0.7770833333333332 | 96.682 |
| 0.7777777777777778 | 92.184 |
| 0.7784722222222222 | 83.205 |
| 0.7791666666666667 | 78.722 |
| 0.779861111111111 | 78.722 |
| 0.7805555555555556 | 74.246 |
| 0.78125 | 74.246 |
| 0.7819444444444444 | 74.246 |
| 0.782638888888889 | 74.246 |
| 0.7833333333333333 | 74.246 |
| 0.7840277777777778 | 69.775 |
| 0.7847222222222222 | 69.775 |
| 0.7854166666666668 | 65.31 |
| 0.7861111111111111 | 65.31 |
| 0.7868055555555555 | 60.85 |
| 0.7875 | 60.85 |
| 0.7881944444444445 | 60.85 |
| 0.7888888888888889 | 56.398 |
| 0.7895833333333333 | 56.398 |
| 0.7902777777777777 | 56.398 |
| 0.7909722222222223 | 51.951 |
| 0.7916666666666666 | 51.951 |
| 0.7923611111111111 | 51.951 |
| 0.7930555555555556 | 47.511 |
| 0.7937500000000001 | 47.511 |
| 0.7944444444444444 | 47.511 |
| 0.7951388888888888 | 47.511 |
| 0.7958333333333334 | 47.511 |
| 0.7965277777777778 | 47.511 |
| 0.7972222222222222 | 43.079 |
| 0.7979166666666666 | 43.079 |
| 0.7986111111111112 | 43.079 |
| 0.7993055555555556 | 43.079 |
| 0.7999999999999999 | 43.079 |
| 0.8006944444444444 | 43.079 |
| 0.8013888888888889 | 43.079 |
| 0.8020833333333334 | 43.079 |
| 0.8027777777777777 | 43.079 |
| 0.8034722222222223 | 43.079 |
| 0.8041666666666667 | 43.079 |
| 0.8048611111111111 | 43.079 |
| 0.8055555555555555 | 43.079 |
| 0.80625 | 43.079 |
| 0.8069444444444445 | 38.653 |
| 0.8076388888888889 | 38.653 |
| 0.8083333333333332 | 38.653 |
| 0.8090277777777778 | 38.653 |
| 0.8097222222222222 | 38.653 |
| 0.8104166666666667 | 34.234 |
| 0.811111111111111 | 34.234 |
| 0.8118055555555556 | 34.234 |
| 0.8125 | 29.823 |
| 0.8131944444444444 | 29.823 |
| 0.813888888888889 | 29.823 |
| 0.8145833333333333 | 29.823 |
| 0.8152777777777778 | 29.823 |
| 0.8159722222222222 | 25.419 |
| 0.8166666666666668 | 25.419 |
| 0.8173611111111111 | 25.419 |
| 0.8180555555555555 | 21.024 |
| 0.81875 | 21.024 |
| 0.8194444444444445 | 21.024 |
| 0.8201388888888889 | 21.024 |
| 0.8208333333333333 | 16.636 |
| 0.8215277777777777 | 16.636 |
| 0.8222222222222223 | 16.636 |
| 0.8229166666666666 | 16.636 |
| 0.8236111111111111 | 12.257 |
| 0.8243055555555556 | 12.257 |
| 0.8250000000000001 | 12.257 |
| 0.8256944444444444 | 12.257 |
| 0.8263888888888888 | 12.257 |
| 0.8270833333333334 | 7.887 |
| 0.8277777777777778 | 7.887 |
| 0.8284722222222222 | 7.887 |
| 0.8291666666666666 | 7.887 |
| 0.8298611111111112 | 3.525 |
| 0.8305555555555556 | 3.525 |
| 0.8312499999999999 | 3.525 |
| 0.8319444444444444 | 3.525 |
| 0.8326388888888889 | 3.525 |
| 0.8333333333333334 | 3.525 |
| 0.8340277777777777 | 3.525 |
| 0.8347222222222223 | 3.525 |
| 0.8354166666666667 | 3.525 |
| 0.8361111111111111 | 3.525 |
| 0.8368055555555555 | 3.525 |
| 0.8375 | 3.525 |
| 0.8381944444444445 | 3.525 |
| 0.8388888888888889 | 0 |
| 0.8395833333333332 | 0 |
| 0.8402777777777778 | 0 |
| 0.8409722222222222 | 0 |
| 0.8416666666666667 | 0 |
| 0.842361111111111 | 0 |
| 0.8430555555555556 | 0 |
| 0.84375 | 0 |
| 0.8444444444444444 | 0 |
| 0.845138888888889 | 0 |
| 0.8458333333333333 | 0 |
| 0.8465277777777778 | 0 |
| 0.8472222222222222 | 0 |
| 0.8479166666666668 | 0 |
| 0.8486111111111111 | 0 |
| 0.8493055555555555 | 0 |
| 0.85 | 0 |
| 0.8506944444444445 | 0 |
| 0.8513888888888889 | 0 |
| 0.8520833333333333 | 0 |
| 0.8527777777777777 | 0 |
| 0.8534722222222223 | 0 |
| 0.8541666666666666 | 0 |
| 0.8548611111111111 | 0 |
| 0.8555555555555556 | 0 |
| 0.8562500000000001 | 0 |
| 0.8569444444444444 | 0 |
| 0.8576388888888888 | 0 |
| 0.8583333333333334 | 0 |
| 0.8590277777777778 | 0 |
| 0.8597222222222222 | 0 |
| 0.8604166666666666 | 0 |
| 0.8611111111111112 | 0 |
| 0.8618055555555556 | 0 |
| 0.8624999999999999 | 0 |
| 0.8631944444444444 | 0 |
| 0.8638888888888889 | 0 |
| 0.8645833333333334 | 0 |
| 0.8652777777777777 | 0 |
| 0.8659722222222223 | 0 |
| 0.8666666666666667 | 0 |
| 0.8673611111111111 | 0 |
| 0.8680555555555555 | 0 |
| 0.86875 | 0 |
| 0.8694444444444445 | 0 |
| 0.8701388888888889 | 0 |
| 0.8708333333333332 | 0 |
| 0.8715277777777778 | 0 |
| 0.8722222222222222 | 0 |
| 0.8729166666666667 | 0 |
| 0.873611111111111 | 0 |
| 0.8743055555555556 | 0 |
| 0.875 | 0 |
| 0.8756944444444444 | 0 |
| 0.876388888888889 | 0 |
| 0.8770833333333333 | 0 |
| 0.8777777777777778 | 0 |
| 0.8784722222222222 | 0 |
| 0.8791666666666668 | 0 |
| 0.8798611111111111 | 0 |
| 0.8805555555555555 | 0 |
| 0.88125 | 0 |
| 0.8819444444444445 | 0 |
| 0.8826388888888889 | 0 |
| 0.8833333333333333 | 0 |
| 0.8840277777777777 | 0 |
| 0.8847222222222223 | 0 |
| 0.8854166666666666 | 0 |
| 0.8861111111111111 | 0 |
| 0.8868055555555556 | 0 |
| 0.8875000000000001 | 0 |
| 0.8881944444444444 | 0 |
| 0.8888888888888888 | 0 |
| 0.8895833333333334 | 0 |
| 0.8902777777777778 | 0 |
| 0.8909722222222222 | 0 |
| 0.8916666666666666 | 0 |
| 0.8923611111111112 | 0 |
| 0.8930555555555556 | 0 |
| 0.8937499999999999 | 0 |
| 0.8944444444444444 | 0 |
| 0.8951388888888889 | 0 |
| 0.8958333333333334 | 0 |
| 0.8965277777777777 | 0 |
| 0.8972222222222223 | 0 |
| 0.8979166666666667 | 0 |
| 0.8986111111111111 | 0 |
| 0.8993055555555555 | 0 |
| 0.9 | 0 |
| 0.9006944444444445 | 0 |
| 0.9013888888888889 | 0 |
| 0.9020833333333332 | 0 |
| 0.9027777777777778 | 0 |
| 0.9034722222222222 | 0 |
| 0.9041666666666667 | 0 |
| 0.904861111111111 | 0 |
| 0.9055555555555556 | 0 |
| 0.90625 | 0 |
| 0.9069444444444444 | 0 |
| 0.907638888888889 | 0 |
| 0.9083333333333333 | 0 |
| 0.9090277777777778 | 0 |
| 0.9097222222222222 | 0 |
| 0.9104166666666668 | 0 |
| 0.9111111111111111 | 0 |
| 0.9118055555555555 | 0 |
| 0.9125 | 0 |
| 0.9131944444444445 | 0 |
| 0.9138888888888889 | 0 |
| 0.9145833333333333 | 0 |
| 0.9152777777777777 | 0 |
| 0.9159722222222223 | 0 |
| 0.9166666666666666 | 0 |
| 0.9173611111111111 | 0 |
| 0.9180555555555556 | 0 |
| 0.9187500000000001 | 0 |
| 0.9194444444444444 | 0 |
| 0.9201388888888888 | 0 |
| 0.9208333333333334 | 0 |
| 0.9215277777777778 | 0 |
| 0.9222222222222222 | 0 |
| 0.9229166666666666 | 0 |
| 0.9236111111111112 | 0 |
| 0.9243055555555556 | 0 |
| 0.9249999999999999 | 0 |
| 0.9256944444444444 | 0 |
| 0.9263888888888889 | 0 |
| 0.9270833333333334 | 0 |
| 0.9277777777777777 | 0 |
| 0.9284722222222223 | 0 |
| 0.9291666666666667 | 0 |
| 0.9298611111111111 | 0 |
| 0.9305555555555555 | 0 |
| 0.93125 | 0 |
| 0.9319444444444445 | 0 |
| 0.9326388888888889 | 0 |
| 0.9333333333333332 | 0 |
| 0.9340277777777778 | 0 |
| 0.9347222222222222 | 0 |
| 0.9354166666666667 | 0 |
| 0.936111111111111 | 0 |
| 0.9368055555555556 | 0 |
| 0.9375 | 0 |
| 0.9381944444444444 | 0 |
| 0.938888888888889 | 0 |
| 0.9395833333333333 | 0 |
| 0.9402777777777778 | 0 |
| 0.9409722222222222 | 0 |
| 0.9416666666666668 | 0 |
| 0.9423611111111111 | 0 |
| 0.9430555555555555 | 0 |
| 0.94375 | 0 |
| 0.9444444444444445 | 0 |
| 0.9451388888888889 | 0 |
| 0.9458333333333333 | 0 |
| 0.9465277777777777 | 0 |
| 0.9472222222222223 | 0 |
| 0.9479166666666666 | 0 |
| 0.9486111111111111 | 0 |
| 0.9493055555555556 | 0 |
| 0.9500000000000001 | 0 |
| 0.9506944444444444 | 0 |
| 0.9513888888888888 | 0 |
| 0.9520833333333334 | 0 |
| 0.9527777777777778 | 0 |
| 0.9534722222222222 | 0 |
| 0.9541666666666666 | 0 |
| 0.9548611111111112 | 0 |
| 0.9555555555555556 | 0 |
| 0.9562499999999999 | 0 |
| 0.9569444444444444 | 0 |
| 0.9576388888888889 | 0 |
| 0.9583333333333334 | 0 |
| 0.9590277777777777 | 0 |
| 0.9597222222222223 | 0 |
| 0.9604166666666667 | 0 |
| 0.9611111111111111 | 0 |
| 0.9618055555555555 | 0 |
| 0.9625 | 0 |
| 0.9631944444444445 | 0 |
| 0.9638888888888889 | 0 |
| 0.9645833333333332 | 0 |
| 0.9652777777777778 | 0 |
| 0.9659722222222222 | 0 |
| 0.9666666666666667 | 0 |
| 0.967361111111111 | 0 |
| 0.9680555555555556 | 0 |
| 0.96875 | 0 |
| 0.9694444444444444 | 0 |
| 0.970138888888889 | 0 |
| 0.9708333333333333 | 0 |
| 0.9715277777777778 | 0 |
| 0.9722222222222222 | 0 |
| 0.9729166666666668 | 0 |
| 0.9736111111111111 | 0 |
| 0.9743055555555555 | 0 |
| 0.975 | 0 |
| 0.9756944444444445 | 0 |
| 0.9763888888888889 | 0 |
| 0.9770833333333333 | 0 |
| 0.9777777777777777 | 0 |
| 0.9784722222222223 | 0 |
| 0.9791666666666666 | 0 |
| 0.9798611111111111 | 0 |
| 0.9805555555555556 | 0 |
| 0.9812500000000001 | 0 |
| 0.9819444444444444 | 0 |
| 0.9826388888888888 | 0 |
| 0.9833333333333334 | 0 |
| 0.9840277777777778 | 0 |
| 0.9847222222222222 | 0 |
| 0.9854166666666666 | 0 |
| 0.9861111111111112 | 0 |
| 0.9868055555555556 | 0 |
| 0.9874999999999999 | 0 |
| 0.9881944444444444 | 0 |
| 0.9888888888888889 | 0 |
| 0.9895833333333334 | 0 |
| 0.9902777777777777 | 0 |
| 0.9909722222222223 | 0 |
| 0.9916666666666667 | 0 |
| 0.9923611111111111 | 0 |
| 0.9930555555555555 | 0 |
| 0.99375 | 0 |
| 0.9944444444444445 | 0 |
| 0.9951388888888889 | 0 |
| 0.9958333333333332 | 0 |
| 0.9965277777777778 | 0 |
| 0.9972222222222222 | 0 |
| 0.9979166666666667 | 0 |
| 0.998611111111111 | 0 |
| 0.9993055555555556 | 0 |